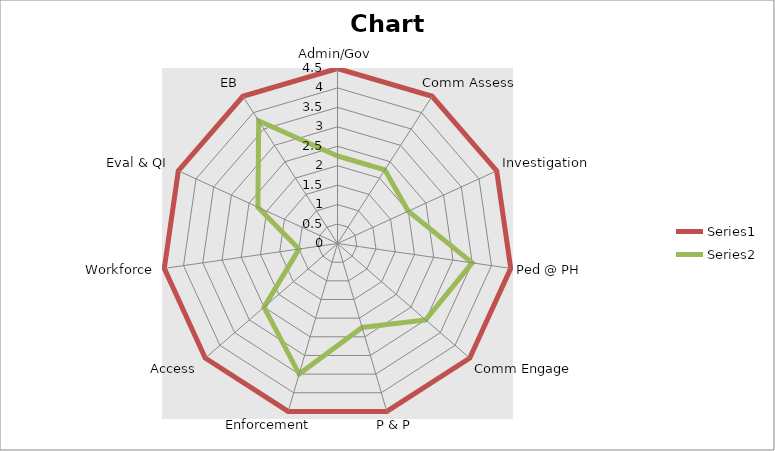
| Category | Series 0 | Series 1 | Series 2 |
|---|---|---|---|
| Admin/Gov |  | 4.5 | 2.25 |
| Comm Assess |  | 4.5 | 2.25 |
| Investigation |  | 4.5 | 2 |
| Ped @ PH |  | 4.5 | 3.5 |
| Comm Engage |  | 4.5 | 3 |
| P & P |  | 4.5 | 2.25 |
| Enforcement |  | 4.5 | 3.5 |
| Access |  | 4.5 | 2.5 |
| Workforce |  | 4.5 | 1 |
| Eval & QI |  | 4.5 | 2.25 |
| EB |  | 4.5 | 3.75 |